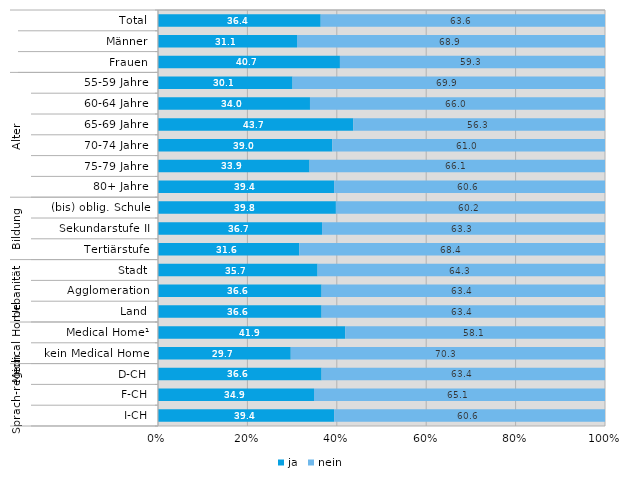
| Category | ja | nein |
|---|---|---|
| 0 | 36.4 | 63.6 |
| 1 | 31.1 | 68.9 |
| 2 | 40.7 | 59.3 |
| 3 | 30.1 | 69.9 |
| 4 | 34 | 66 |
| 5 | 43.7 | 56.3 |
| 6 | 39 | 61 |
| 7 | 33.9 | 66.1 |
| 8 | 39.4 | 60.6 |
| 9 | 39.8 | 60.2 |
| 10 | 36.7 | 63.3 |
| 11 | 31.6 | 68.4 |
| 12 | 35.7 | 64.3 |
| 13 | 36.6 | 63.4 |
| 14 | 36.6 | 63.4 |
| 15 | 41.9 | 58.1 |
| 16 | 29.7 | 70.3 |
| 17 | 36.6 | 63.4 |
| 18 | 34.9 | 65.1 |
| 19 | 39.4 | 60.6 |